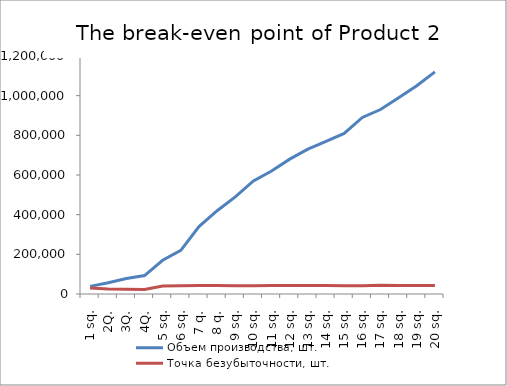
| Category | Объем производства, шт. | Точка безубыточности, шт. |
|---|---|---|
| 1 sq. | 38571.429 | 30137.742 |
| 2Q. | 57142.857 | 25556.358 |
| 3Q. | 78571.429 | 24369.649 |
| 4Q. | 92857.143 | 22687.672 |
| 5 sq. | 170000 | 40269.731 |
| 6 sq. | 220000 | 41744.542 |
| 7 q. | 340000 | 42970.391 |
| 8 q. | 420000 | 42765.23 |
| 9 sq. | 490000 | 42102.38 |
| 10 sq. | 570000 | 41216.79 |
| 11 sq. | 620000 | 42944.74 |
| 12 sq. | 680000 | 43099.895 |
| 13 sq. | 730000 | 43068.061 |
| 14 sq. | 770000 | 42653.447 |
| 15 sq. | 810000 | 41856.072 |
| 16 sq. | 890000 | 41915.913 |
| 17 sq. | 930000 | 43959.28 |
| 18 sq. | 990000 | 43446.028 |
| 19 sq. | 1050000 | 42693.867 |
| 20 sq. | 1120000 | 42906.884 |